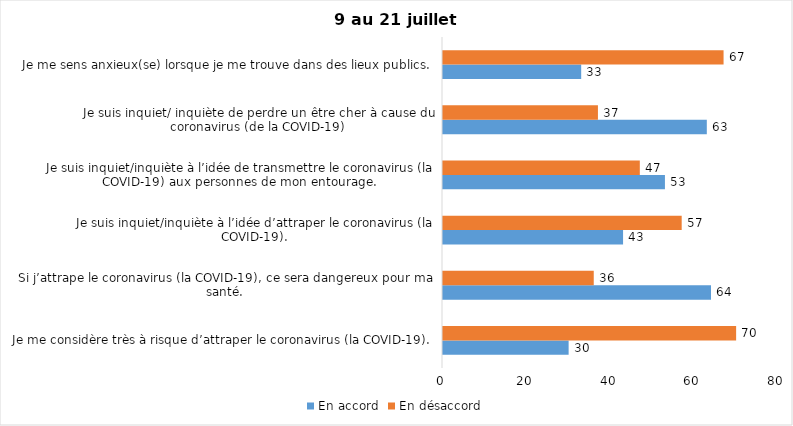
| Category | En accord | En désaccord |
|---|---|---|
| Je me considère très à risque d’attraper le coronavirus (la COVID-19). | 30 | 70 |
| Si j’attrape le coronavirus (la COVID-19), ce sera dangereux pour ma santé. | 64 | 36 |
| Je suis inquiet/inquiète à l’idée d’attraper le coronavirus (la COVID-19). | 43 | 57 |
| Je suis inquiet/inquiète à l’idée de transmettre le coronavirus (la COVID-19) aux personnes de mon entourage. | 53 | 47 |
| Je suis inquiet/ inquiète de perdre un être cher à cause du coronavirus (de la COVID-19) | 63 | 37 |
| Je me sens anxieux(se) lorsque je me trouve dans des lieux publics. | 33 | 67 |